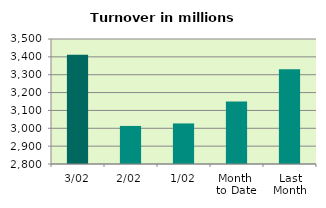
| Category | Series 0 |
|---|---|
| 3/02 | 3411.178 |
| 2/02 | 3013.212 |
| 1/02 | 3027.102 |
| Month 
to Date | 3150.497 |
| Last
Month | 3330.335 |